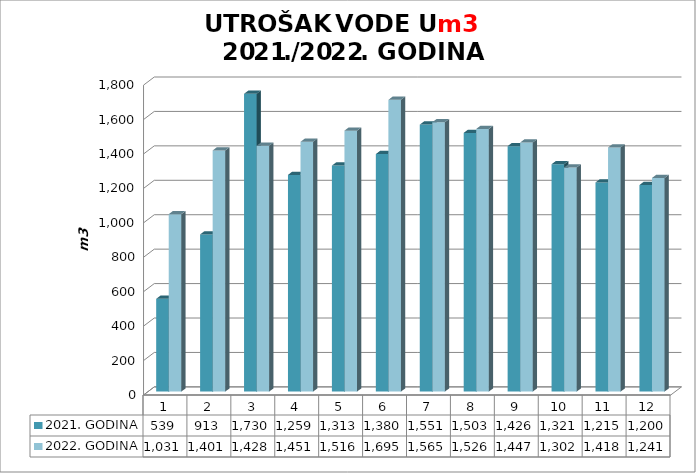
| Category | 2021. GODINA | 2022. GODINA |
|---|---|---|
| 0 | 539 | 1031 |
| 1 | 913 | 1401 |
| 2 | 1730 | 1428 |
| 3 | 1259 | 1451 |
| 4 | 1313 | 1516 |
| 5 | 1380 | 1695 |
| 6 | 1551 | 1565 |
| 7 | 1503 | 1526 |
| 8 | 1426 | 1447 |
| 9 | 1321 | 1302 |
| 10 | 1215 | 1418 |
| 11 | 1200 | 1241 |